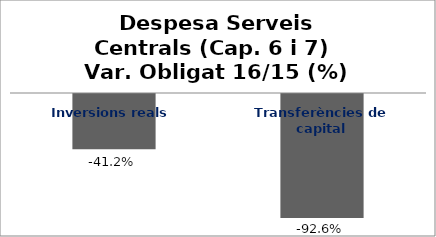
| Category | Series 0 |
|---|---|
| Inversions reals | -0.412 |
| Transferències de capital | -0.926 |